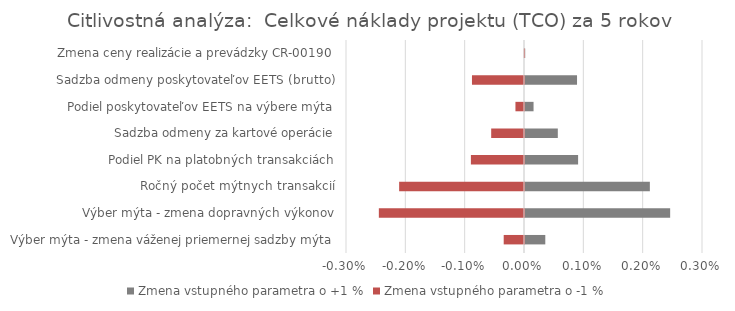
| Category | Zmena vstupného parametra o +1 % | Zmena vstupného parametra o -1 % |
|---|---|---|
| Výber mýta - zmena váženej priemernej sadzby mýta | 0 | 0 |
| Výber mýta - zmena dopravných výkonov | 0.002 | -0.002 |
| Ročný počet mýtnych transakcií | 0.002 | -0.002 |
| Podiel PK na platobných transakciách | 0.001 | -0.001 |
| Sadzba odmeny za kartové operácie | 0.001 | -0.001 |
| Podiel poskytovateľov EETS na výbere mýta | 0 | 0 |
| Sadzba odmeny poskytovateľov EETS (brutto) | 0.001 | -0.001 |
| Zmena ceny realizácie a prevádzky CR-00190 | 0 | 0 |